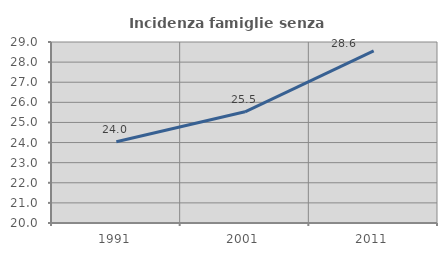
| Category | Incidenza famiglie senza nuclei |
|---|---|
| 1991.0 | 24.039 |
| 2001.0 | 25.53 |
| 2011.0 | 28.562 |